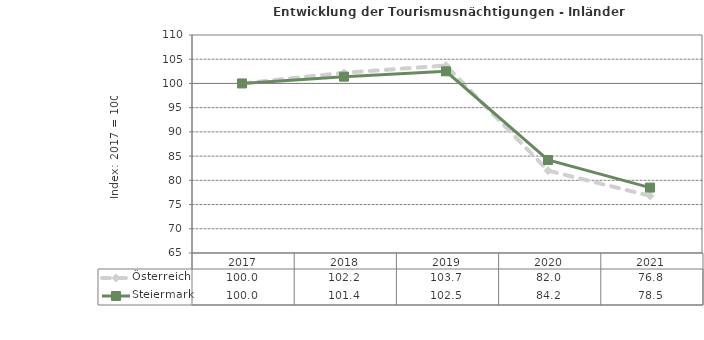
| Category | Österreich | Steiermark |
|---|---|---|
| 2021.0 | 76.8 | 78.5 |
| 2020.0 | 82 | 84.2 |
| 2019.0 | 103.7 | 102.5 |
| 2018.0 | 102.2 | 101.4 |
| 2017.0 | 100 | 100 |